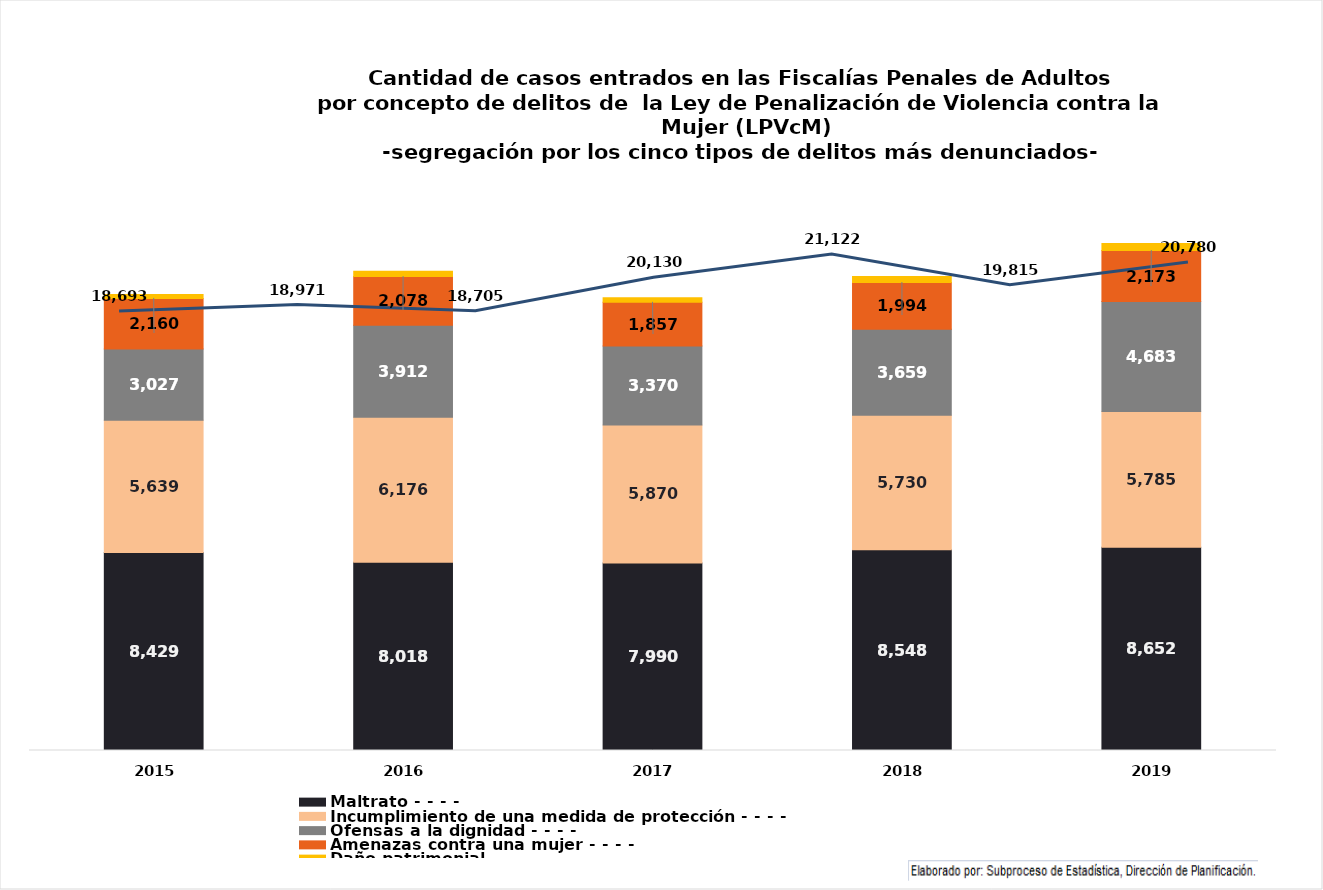
| Category | Maltrato | Incumplimiento de una medida de protección | Ofensas a la dignidad | Amenazas contra una mujer | Daño patrimonial |
|---|---|---|---|---|---|
| 2018.0 | 8429 | 5639 | 3027 | 2160 | 169 |
| 2019.0 | 8018 | 6176 | 3912 | 2078 | 225 |
| 2020.0 | 7990 | 5870 | 3370 | 1857 | 195 |
| 2021.0 | 8548 | 5730 | 3659 | 1994 | 258 |
| 2022.0 | 8652 | 5785 | 4683 | 2173 | 298 |